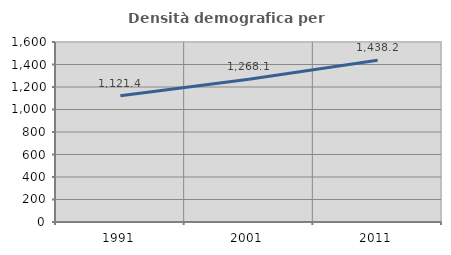
| Category | Densità demografica |
|---|---|
| 1991.0 | 1121.443 |
| 2001.0 | 1268.086 |
| 2011.0 | 1438.192 |